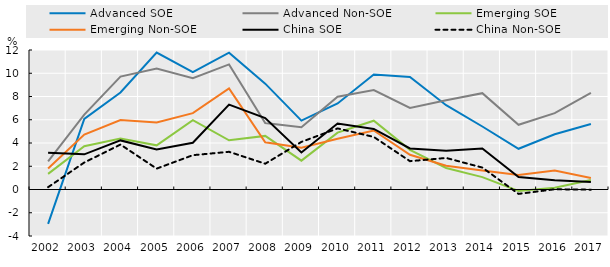
| Category | Advanced SOE | Advanced Non-SOE | Emerging SOE | Emerging Non-SOE | China SOE | China Non-SOE |
|---|---|---|---|---|---|---|
| 2002.0 | -2.952 | 2.427 | 1.341 | 1.798 | 3.159 | 0.2 |
| 2003.0 | 6.078 | 6.443 | 3.729 | 4.729 | 3.025 | 2.321 |
| 2004.0 | 8.349 | 9.713 | 4.384 | 5.974 | 4.223 | 3.866 |
| 2005.0 | 11.776 | 10.416 | 3.799 | 5.758 | 3.447 | 1.797 |
| 2006.0 | 10.09 | 9.582 | 5.973 | 6.564 | 4.019 | 2.952 |
| 2007.0 | 11.768 | 10.763 | 4.229 | 8.695 | 7.3 | 3.243 |
| 2008.0 | 9.104 | 5.712 | 4.611 | 4.059 | 6.146 | 2.217 |
| 2009.0 | 5.924 | 5.349 | 2.481 | 3.6 | 3.185 | 4.093 |
| 2010.0 | 7.401 | 7.984 | 4.89 | 4.359 | 5.68 | 5.255 |
| 2011.0 | 9.896 | 8.556 | 5.916 | 5.077 | 5.214 | 4.522 |
| 2012.0 | 9.684 | 7.023 | 3.411 | 2.992 | 3.536 | 2.437 |
| 2013.0 | 7.254 | 7.671 | 1.853 | 2.048 | 3.331 | 2.714 |
| 2014.0 | 5.42 | 8.287 | 1.066 | 1.644 | 3.521 | 1.886 |
| 2015.0 | 3.503 | 5.564 | -0.126 | 1.245 | 1.074 | -0.379 |
| 2016.0 | 4.752 | 6.572 | 0.146 | 1.63 | 0.786 | 0.022 |
| 2017.0 | 5.628 | 8.319 | 0.809 | 0.986 | 0.655 | -0.015 |